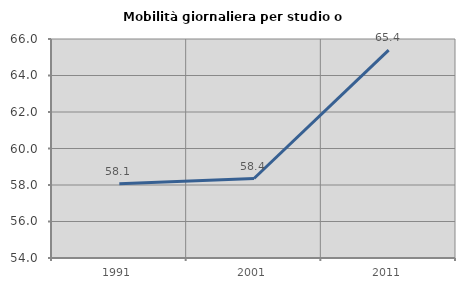
| Category | Mobilità giornaliera per studio o lavoro |
|---|---|
| 1991.0 | 58.065 |
| 2001.0 | 58.356 |
| 2011.0 | 65.391 |